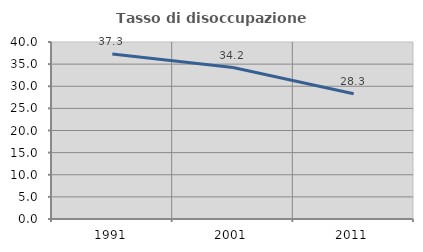
| Category | Tasso di disoccupazione giovanile  |
|---|---|
| 1991.0 | 37.266 |
| 2001.0 | 34.23 |
| 2011.0 | 28.319 |